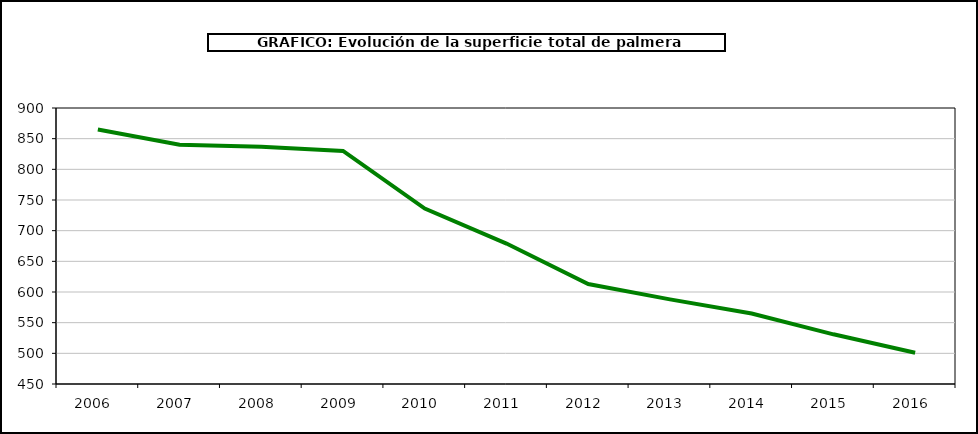
| Category | superficie kiwi |
|---|---|
| 2006.0 | 865 |
| 2007.0 | 840 |
| 2008.0 | 837 |
| 2009.0 | 830 |
| 2010.0 | 736 |
| 2011.0 | 679 |
| 2012.0 | 613 |
| 2013.0 | 588 |
| 2014.0 | 565 |
| 2015.0 | 531 |
| 2016.0 | 501 |